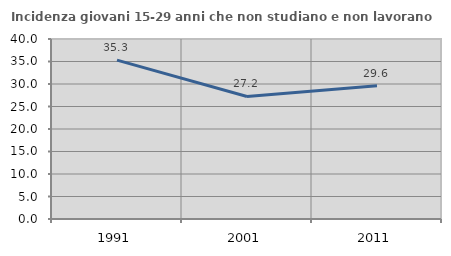
| Category | Incidenza giovani 15-29 anni che non studiano e non lavorano  |
|---|---|
| 1991.0 | 35.294 |
| 2001.0 | 27.231 |
| 2011.0 | 29.61 |